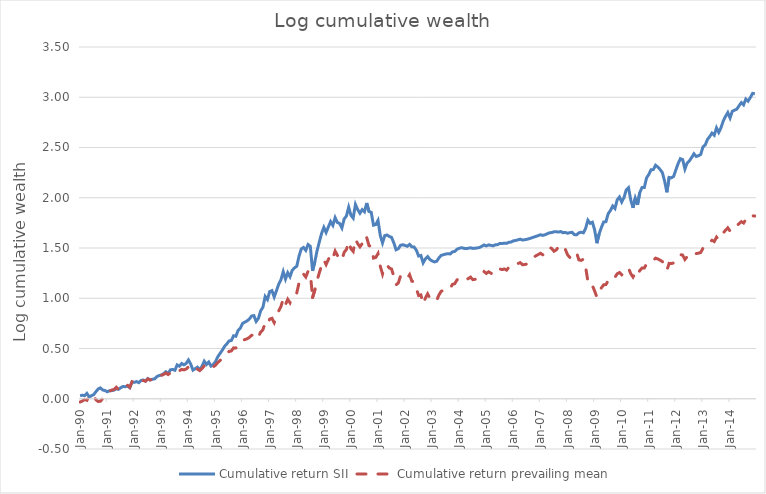
| Category | Cumulative return SII | Cumulative return prevailing mean |
|---|---|---|
| 1990-01-01 | 0.03 | -0.032 |
| 1990-02-01 | 0.035 | -0.023 |
| 1990-03-01 | 0.031 | -0.007 |
| 1990-04-01 | 0.053 | -0.016 |
| 1990-05-01 | 0.019 | 0.032 |
| 1990-06-01 | 0.03 | 0.031 |
| 1990-07-01 | 0.041 | 0.032 |
| 1990-08-01 | 0.07 | -0.011 |
| 1990-09-01 | 0.097 | -0.027 |
| 1990-10-01 | 0.108 | -0.025 |
| 1990-11-01 | 0.087 | 0.002 |
| 1990-12-01 | 0.082 | 0.017 |
| 1991-01-01 | 0.069 | 0.039 |
| 1991-02-01 | 0.08 | 0.073 |
| 1991-03-01 | 0.081 | 0.087 |
| 1991-04-01 | 0.086 | 0.091 |
| 1991-05-01 | 0.099 | 0.114 |
| 1991-06-01 | 0.094 | 0.093 |
| 1991-07-01 | 0.11 | 0.117 |
| 1991-08-01 | 0.122 | 0.131 |
| 1991-09-01 | 0.119 | 0.125 |
| 1991-10-01 | 0.128 | 0.134 |
| 1991-11-01 | 0.11 | 0.115 |
| 1991-12-01 | 0.165 | 0.17 |
| 1992-01-01 | 0.163 | 0.162 |
| 1992-02-01 | 0.171 | 0.17 |
| 1992-03-01 | 0.16 | 0.161 |
| 1992-04-01 | 0.182 | 0.177 |
| 1992-05-01 | 0.187 | 0.181 |
| 1992-06-01 | 0.175 | 0.175 |
| 1992-07-01 | 0.201 | 0.197 |
| 1992-08-01 | 0.186 | 0.187 |
| 1992-09-01 | 0.194 | 0.194 |
| 1992-10-01 | 0.198 | 0.198 |
| 1992-11-01 | 0.22 | 0.218 |
| 1992-12-01 | 0.231 | 0.227 |
| 1993-01-01 | 0.236 | 0.233 |
| 1993-02-01 | 0.249 | 0.242 |
| 1993-03-01 | 0.269 | 0.255 |
| 1993-04-01 | 0.25 | 0.241 |
| 1993-05-01 | 0.288 | 0.258 |
| 1993-06-01 | 0.292 | 0.261 |
| 1993-07-01 | 0.283 | 0.259 |
| 1993-08-01 | 0.337 | 0.283 |
| 1993-09-01 | 0.324 | 0.279 |
| 1993-10-01 | 0.351 | 0.292 |
| 1993-11-01 | 0.337 | 0.287 |
| 1993-12-01 | 0.352 | 0.296 |
| 1994-01-01 | 0.386 | 0.318 |
| 1994-02-01 | 0.345 | 0.301 |
| 1994-03-01 | 0.285 | 0.275 |
| 1994-04-01 | 0.299 | 0.283 |
| 1994-05-01 | 0.314 | 0.294 |
| 1994-06-01 | 0.288 | 0.28 |
| 1994-07-01 | 0.323 | 0.301 |
| 1994-08-01 | 0.374 | 0.327 |
| 1994-09-01 | 0.341 | 0.312 |
| 1994-10-01 | 0.366 | 0.328 |
| 1994-11-01 | 0.325 | 0.306 |
| 1994-12-01 | 0.341 | 0.317 |
| 1995-01-01 | 0.37 | 0.334 |
| 1995-02-01 | 0.418 | 0.36 |
| 1995-03-01 | 0.451 | 0.381 |
| 1995-04-01 | 0.483 | 0.401 |
| 1995-05-01 | 0.521 | 0.429 |
| 1995-06-01 | 0.545 | 0.447 |
| 1995-07-01 | 0.576 | 0.472 |
| 1995-08-01 | 0.579 | 0.475 |
| 1995-09-01 | 0.627 | 0.506 |
| 1995-10-01 | 0.622 | 0.505 |
| 1995-11-01 | 0.68 | 0.538 |
| 1995-12-01 | 0.703 | 0.552 |
| 1996-01-01 | 0.75 | 0.58 |
| 1996-02-01 | 0.763 | 0.589 |
| 1996-03-01 | 0.774 | 0.597 |
| 1996-04-01 | 0.794 | 0.61 |
| 1996-05-01 | 0.823 | 0.631 |
| 1996-06-01 | 0.827 | 0.636 |
| 1996-07-01 | 0.769 | 0.599 |
| 1996-08-01 | 0.799 | 0.617 |
| 1996-09-01 | 0.874 | 0.663 |
| 1996-10-01 | 0.91 | 0.687 |
| 1996-11-01 | 1.017 | 0.755 |
| 1996-12-01 | 0.987 | 0.736 |
| 1997-01-01 | 1.066 | 0.793 |
| 1997-02-01 | 1.076 | 0.8 |
| 1997-03-01 | 1.012 | 0.757 |
| 1997-04-01 | 1.075 | 0.814 |
| 1997-05-01 | 1.14 | 0.873 |
| 1997-06-01 | 1.185 | 0.917 |
| 1997-07-01 | 1.264 | 0.998 |
| 1997-08-01 | 1.191 | 0.937 |
| 1997-09-01 | 1.254 | 0.99 |
| 1997-10-01 | 1.214 | 0.955 |
| 1997-11-01 | 1.279 | 1.014 |
| 1997-12-01 | 1.303 | 1.037 |
| 1998-01-01 | 1.318 | 1.053 |
| 1998-02-01 | 1.419 | 1.153 |
| 1998-03-01 | 1.491 | 1.226 |
| 1998-04-01 | 1.506 | 1.24 |
| 1998-05-01 | 1.477 | 1.211 |
| 1998-06-01 | 1.534 | 1.269 |
| 1998-07-01 | 1.517 | 1.252 |
| 1998-08-01 | 1.273 | 1.007 |
| 1998-09-01 | 1.361 | 1.082 |
| 1998-10-01 | 1.473 | 1.177 |
| 1998-11-01 | 1.561 | 1.253 |
| 1998-12-01 | 1.645 | 1.328 |
| 1999-01-01 | 1.705 | 1.382 |
| 1999-02-01 | 1.654 | 1.336 |
| 1999-03-01 | 1.709 | 1.386 |
| 1999-04-01 | 1.762 | 1.434 |
| 1999-05-01 | 1.725 | 1.4 |
| 1999-06-01 | 1.802 | 1.47 |
| 1999-07-01 | 1.754 | 1.426 |
| 1999-08-01 | 1.744 | 1.418 |
| 1999-09-01 | 1.699 | 1.377 |
| 1999-10-01 | 1.789 | 1.458 |
| 1999-11-01 | 1.818 | 1.484 |
| 1999-12-01 | 1.906 | 1.565 |
| 2000-01-01 | 1.826 | 1.492 |
| 2000-02-01 | 1.797 | 1.466 |
| 2000-03-01 | 1.933 | 1.588 |
| 2000-04-01 | 1.882 | 1.543 |
| 2000-05-01 | 1.846 | 1.512 |
| 2000-06-01 | 1.882 | 1.545 |
| 2000-07-01 | 1.86 | 1.526 |
| 2000-08-01 | 1.948 | 1.604 |
| 2000-09-01 | 1.863 | 1.524 |
| 2000-10-01 | 1.855 | 1.516 |
| 2000-11-01 | 1.727 | 1.4 |
| 2000-12-01 | 1.733 | 1.406 |
| 2001-01-01 | 1.774 | 1.445 |
| 2001-02-01 | 1.625 | 1.319 |
| 2001-03-01 | 1.55 | 1.242 |
| 2001-04-01 | 1.623 | 1.322 |
| 2001-05-01 | 1.629 | 1.329 |
| 2001-06-01 | 1.615 | 1.302 |
| 2001-07-01 | 1.606 | 1.291 |
| 2001-08-01 | 1.552 | 1.219 |
| 2001-09-01 | 1.483 | 1.134 |
| 2001-10-01 | 1.493 | 1.152 |
| 2001-11-01 | 1.527 | 1.223 |
| 2001-12-01 | 1.533 | 1.232 |
| 2002-01-01 | 1.525 | 1.217 |
| 2002-02-01 | 1.517 | 1.197 |
| 2002-03-01 | 1.536 | 1.234 |
| 2002-04-01 | 1.512 | 1.17 |
| 2002-05-01 | 1.51 | 1.163 |
| 2002-06-01 | 1.478 | 1.094 |
| 2002-07-01 | 1.42 | 1.027 |
| 2002-08-01 | 1.425 | 1.033 |
| 2002-09-01 | 1.352 | 0.941 |
| 2002-10-01 | 1.392 | 1.002 |
| 2002-11-01 | 1.415 | 1.044 |
| 2002-12-01 | 1.385 | 1 |
| 2003-01-01 | 1.371 | 0.981 |
| 2003-02-01 | 1.362 | 0.971 |
| 2003-03-01 | 1.368 | 0.978 |
| 2003-04-01 | 1.402 | 1.033 |
| 2003-05-01 | 1.427 | 1.07 |
| 2003-06-01 | 1.433 | 1.079 |
| 2003-07-01 | 1.44 | 1.092 |
| 2003-08-01 | 1.444 | 1.106 |
| 2003-09-01 | 1.441 | 1.098 |
| 2003-10-01 | 1.462 | 1.138 |
| 2003-11-01 | 1.466 | 1.145 |
| 2003-12-01 | 1.488 | 1.183 |
| 2004-01-01 | 1.497 | 1.197 |
| 2004-02-01 | 1.503 | 1.208 |
| 2004-03-01 | 1.498 | 1.197 |
| 2004-04-01 | 1.494 | 1.185 |
| 2004-05-01 | 1.498 | 1.196 |
| 2004-06-01 | 1.502 | 1.211 |
| 2004-07-01 | 1.496 | 1.185 |
| 2004-08-01 | 1.498 | 1.188 |
| 2004-09-01 | 1.501 | 1.197 |
| 2004-10-01 | 1.505 | 1.208 |
| 2004-11-01 | 1.517 | 1.239 |
| 2004-12-01 | 1.53 | 1.265 |
| 2005-01-01 | 1.52 | 1.247 |
| 2005-02-01 | 1.531 | 1.263 |
| 2005-03-01 | 1.526 | 1.25 |
| 2005-04-01 | 1.521 | 1.236 |
| 2005-05-01 | 1.532 | 1.261 |
| 2005-06-01 | 1.534 | 1.262 |
| 2005-07-01 | 1.545 | 1.291 |
| 2005-08-01 | 1.544 | 1.285 |
| 2005-09-01 | 1.549 | 1.292 |
| 2005-10-01 | 1.546 | 1.28 |
| 2005-11-01 | 1.557 | 1.31 |
| 2005-12-01 | 1.559 | 1.31 |
| 2006-01-01 | 1.571 | 1.331 |
| 2006-02-01 | 1.575 | 1.334 |
| 2006-03-01 | 1.581 | 1.345 |
| 2006-04-01 | 1.588 | 1.355 |
| 2006-05-01 | 1.579 | 1.333 |
| 2006-06-01 | 1.582 | 1.335 |
| 2006-07-01 | 1.587 | 1.341 |
| 2006-08-01 | 1.593 | 1.36 |
| 2006-09-01 | 1.6 | 1.381 |
| 2006-10-01 | 1.608 | 1.407 |
| 2006-11-01 | 1.616 | 1.423 |
| 2006-12-01 | 1.623 | 1.435 |
| 2007-01-01 | 1.632 | 1.448 |
| 2007-02-01 | 1.625 | 1.432 |
| 2007-03-01 | 1.632 | 1.442 |
| 2007-04-01 | 1.642 | 1.479 |
| 2007-05-01 | 1.651 | 1.508 |
| 2007-06-01 | 1.654 | 1.494 |
| 2007-07-01 | 1.661 | 1.467 |
| 2007-08-01 | 1.662 | 1.481 |
| 2007-09-01 | 1.658 | 1.514 |
| 2007-10-01 | 1.664 | 1.529 |
| 2007-11-01 | 1.653 | 1.492 |
| 2007-12-01 | 1.654 | 1.487 |
| 2008-01-01 | 1.647 | 1.432 |
| 2008-02-01 | 1.653 | 1.406 |
| 2008-03-01 | 1.656 | 1.404 |
| 2008-04-01 | 1.633 | 1.443 |
| 2008-05-01 | 1.631 | 1.454 |
| 2008-06-01 | 1.651 | 1.382 |
| 2008-07-01 | 1.657 | 1.377 |
| 2008-08-01 | 1.651 | 1.389 |
| 2008-09-01 | 1.695 | 1.312 |
| 2008-10-01 | 1.777 | 1.168 |
| 2008-11-01 | 1.745 | 1.119 |
| 2008-12-01 | 1.756 | 1.126 |
| 2009-01-01 | 1.68 | 1.072 |
| 2009-02-01 | 1.548 | 1.01 |
| 2009-03-01 | 1.641 | 1.055 |
| 2009-04-01 | 1.706 | 1.104 |
| 2009-05-01 | 1.759 | 1.134 |
| 2009-06-01 | 1.762 | 1.136 |
| 2009-07-01 | 1.841 | 1.178 |
| 2009-08-01 | 1.873 | 1.198 |
| 2009-09-01 | 1.918 | 1.219 |
| 2009-10-01 | 1.893 | 1.208 |
| 2009-11-01 | 1.98 | 1.244 |
| 2009-12-01 | 2.007 | 1.256 |
| 2010-01-01 | 1.957 | 1.233 |
| 2010-02-01 | 2.002 | 1.252 |
| 2010-03-01 | 2.078 | 1.289 |
| 2010-04-01 | 2.1 | 1.3 |
| 2010-05-01 | 1.979 | 1.245 |
| 2010-06-01 | 1.9 | 1.211 |
| 2010-07-01 | 1.996 | 1.252 |
| 2010-08-01 | 1.93 | 1.224 |
| 2010-09-01 | 2.052 | 1.277 |
| 2010-10-01 | 2.102 | 1.3 |
| 2010-11-01 | 2.102 | 1.3 |
| 2010-12-01 | 2.197 | 1.342 |
| 2011-01-01 | 2.232 | 1.357 |
| 2011-02-01 | 2.279 | 1.378 |
| 2011-03-01 | 2.28 | 1.379 |
| 2011-04-01 | 2.323 | 1.399 |
| 2011-05-01 | 2.306 | 1.391 |
| 2011-06-01 | 2.281 | 1.379 |
| 2011-07-01 | 2.251 | 1.365 |
| 2011-08-01 | 2.166 | 1.326 |
| 2011-09-01 | 2.054 | 1.278 |
| 2011-10-01 | 2.202 | 1.347 |
| 2011-11-01 | 2.198 | 1.345 |
| 2011-12-01 | 2.212 | 1.351 |
| 2012-01-01 | 2.278 | 1.382 |
| 2012-02-01 | 2.341 | 1.411 |
| 2012-03-01 | 2.389 | 1.434 |
| 2012-04-01 | 2.38 | 1.429 |
| 2012-05-01 | 2.286 | 1.386 |
| 2012-06-01 | 2.346 | 1.414 |
| 2012-07-01 | 2.367 | 1.424 |
| 2012-08-01 | 2.401 | 1.44 |
| 2012-09-01 | 2.438 | 1.459 |
| 2012-10-01 | 2.411 | 1.444 |
| 2012-11-01 | 2.418 | 1.449 |
| 2012-12-01 | 2.43 | 1.455 |
| 2013-01-01 | 2.506 | 1.498 |
| 2013-02-01 | 2.525 | 1.509 |
| 2013-03-01 | 2.58 | 1.54 |
| 2013-04-01 | 2.609 | 1.557 |
| 2013-05-01 | 2.643 | 1.577 |
| 2013-06-01 | 2.622 | 1.564 |
| 2013-07-01 | 2.696 | 1.608 |
| 2013-08-01 | 2.651 | 1.582 |
| 2013-09-01 | 2.697 | 1.609 |
| 2013-10-01 | 2.764 | 1.65 |
| 2013-11-01 | 2.809 | 1.677 |
| 2013-12-01 | 2.847 | 1.701 |
| 2014-01-01 | 2.794 | 1.668 |
| 2014-02-01 | 2.86 | 1.708 |
| 2014-03-01 | 2.872 | 1.716 |
| 2014-04-01 | 2.882 | 1.722 |
| 2014-05-01 | 2.916 | 1.743 |
| 2014-06-01 | 2.946 | 1.762 |
| 2014-07-01 | 2.925 | 1.749 |
| 2014-08-01 | 2.982 | 1.785 |
| 2014-09-01 | 2.961 | 1.772 |
| 2014-10-01 | 2.998 | 1.794 |
| 2014-11-01 | 3.039 | 1.82 |
| 2014-12-01 | 3.035 | 1.818 |